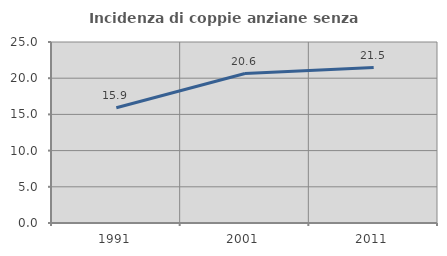
| Category | Incidenza di coppie anziane senza figli  |
|---|---|
| 1991.0 | 15.915 |
| 2001.0 | 20.641 |
| 2011.0 | 21.468 |